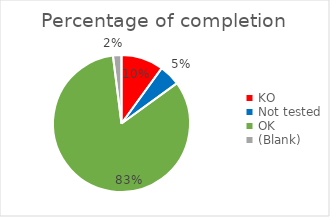
| Category | Series 0 |
|---|---|
| KO | 0.1 |
| Not tested | 0.05 |
| OK | 0.83 |
| (Blank) | 0.02 |